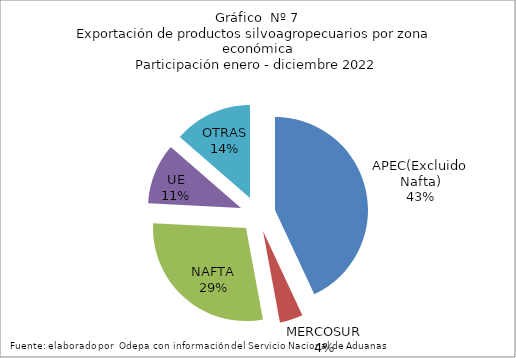
| Category | Series 0 |
|---|---|
| APEC(Excluido Nafta) | 8000438.637 |
| MERCOSUR | 748173.077 |
| NAFTA | 5340532.815 |
| UE | 1961634.261 |
| OTRAS | 2532669.209 |